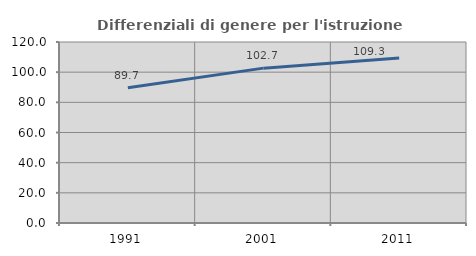
| Category | Differenziali di genere per l'istruzione superiore |
|---|---|
| 1991.0 | 89.655 |
| 2001.0 | 102.673 |
| 2011.0 | 109.335 |